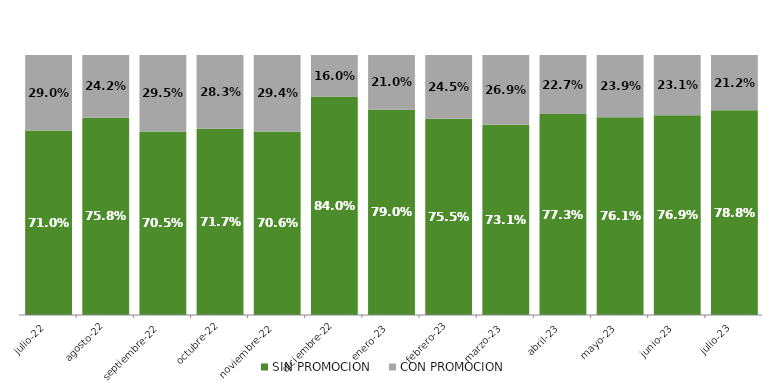
| Category | SIN PROMOCION   | CON PROMOCION   |
|---|---|---|
| 2022-07-01 | 0.71 | 0.29 |
| 2022-08-01 | 0.758 | 0.242 |
| 2022-09-01 | 0.705 | 0.295 |
| 2022-10-01 | 0.717 | 0.283 |
| 2022-11-01 | 0.706 | 0.294 |
| 2022-12-01 | 0.84 | 0.16 |
| 2023-01-01 | 0.79 | 0.21 |
| 2023-02-01 | 0.755 | 0.245 |
| 2023-03-01 | 0.731 | 0.269 |
| 2023-04-01 | 0.773 | 0.227 |
| 2023-05-01 | 0.761 | 0.239 |
| 2023-06-01 | 0.769 | 0.231 |
| 2023-07-01 | 0.788 | 0.212 |